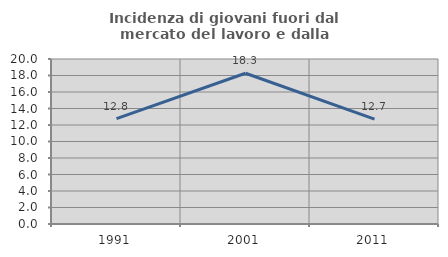
| Category | Incidenza di giovani fuori dal mercato del lavoro e dalla formazione  |
|---|---|
| 1991.0 | 12.775 |
| 2001.0 | 18.274 |
| 2011.0 | 12.702 |